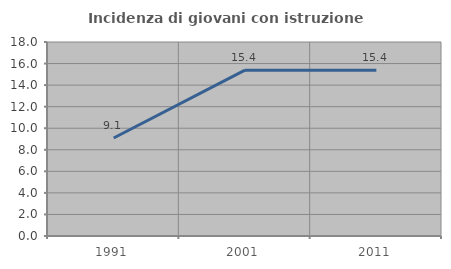
| Category | Incidenza di giovani con istruzione universitaria |
|---|---|
| 1991.0 | 9.091 |
| 2001.0 | 15.385 |
| 2011.0 | 15.385 |